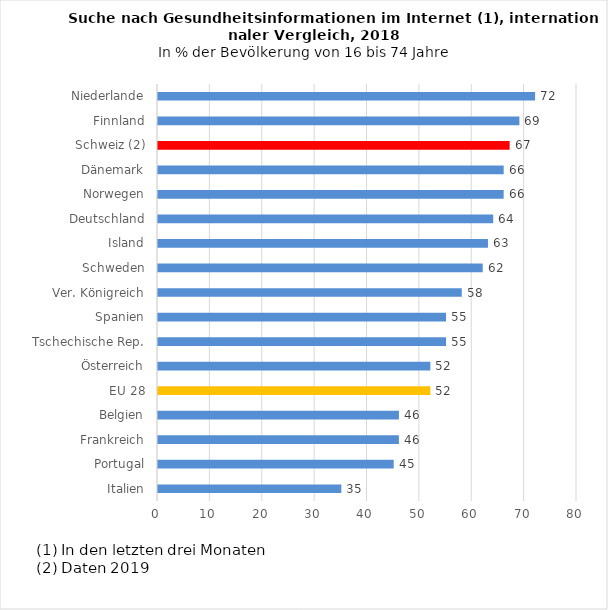
| Category | 2018 |
|---|---|
| Italien | 35 |
| Portugal | 45 |
| Frankreich | 46 |
| Belgien | 46 |
| EU 28 | 52 |
| Österreich | 52 |
| Tschechische Rep. | 55 |
| Spanien | 55 |
| Ver. Königreich | 58 |
| Schweden | 62 |
| Island | 63 |
| Deutschland | 64 |
| Norwegen | 66 |
| Dänemark | 66 |
| Schweiz (2) | 67.138 |
| Finnland | 69 |
| Niederlande | 72 |